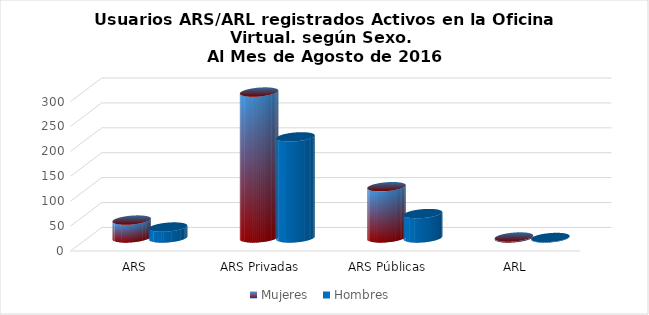
| Category | Mujeres | Hombres |
|---|---|---|
| ARS Autogestionadas | 36 | 22 |
| ARS Privadas | 293 | 203 |
| ARS Públicas | 103 | 49 |
| ARL | 2 | 1 |